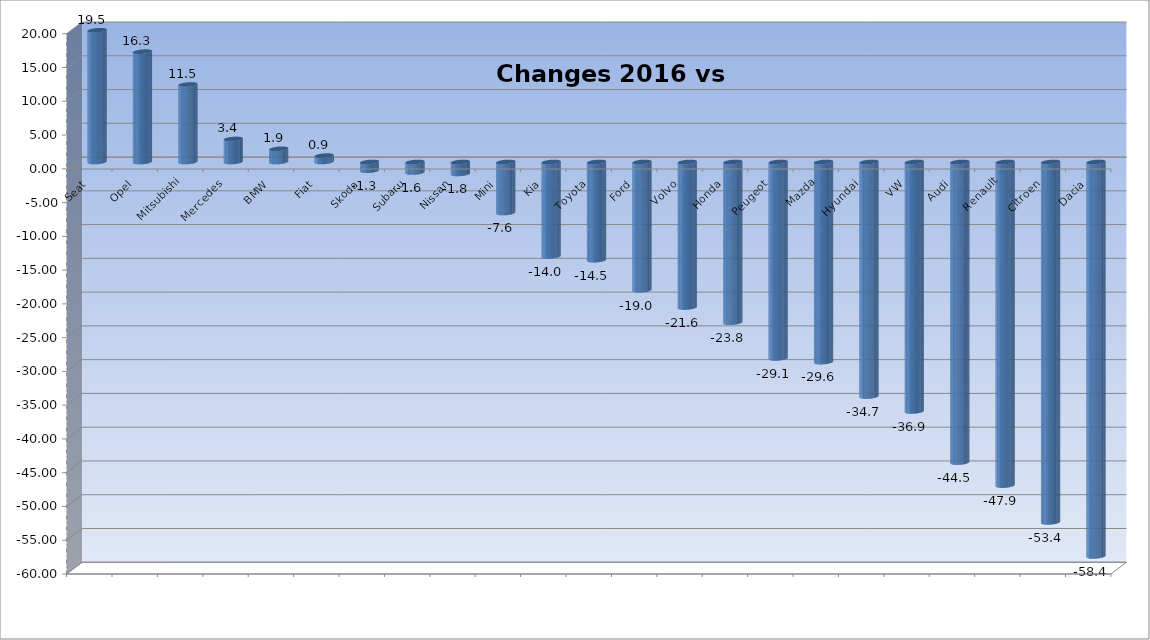
| Category | Ytd 2015 |
|---|---|
| Seat | 19.507 |
| Opel | 16.34 |
| Mitsubishi | 11.48 |
| Mercedes | 3.413 |
| BMW | 1.948 |
| Fiat | 0.943 |
| Skoda | -1.284 |
| Subaru | -1.559 |
| Nissan | -1.763 |
| Mini | -7.553 |
| Kia | -13.983 |
| Toyota | -14.539 |
| Ford | -18.998 |
| Volvo | -21.552 |
| Honda | -23.792 |
| Peugeot | -29.086 |
| Mazda | -29.63 |
| Hyundai | -34.734 |
| VW | -36.945 |
| Audi | -44.509 |
| Renault | -47.917 |
| Citroen | -53.365 |
| Dacia | -58.402 |